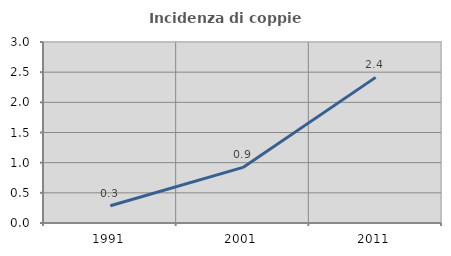
| Category | Incidenza di coppie miste |
|---|---|
| 1991.0 | 0.287 |
| 2001.0 | 0.921 |
| 2011.0 | 2.414 |